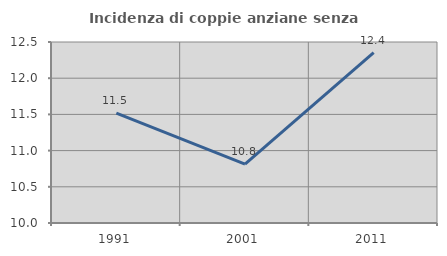
| Category | Incidenza di coppie anziane senza figli  |
|---|---|
| 1991.0 | 11.517 |
| 2001.0 | 10.815 |
| 2011.0 | 12.353 |